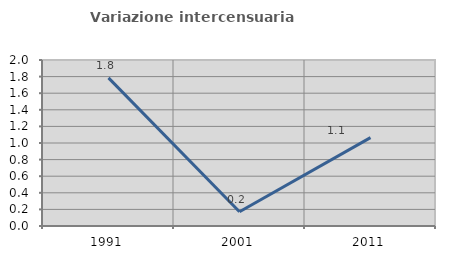
| Category | Variazione intercensuaria annua |
|---|---|
| 1991.0 | 1.784 |
| 2001.0 | 0.172 |
| 2011.0 | 1.065 |